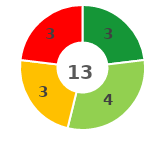
| Category | Series 0 |
|---|---|
| 0 | 3 |
| 1 | 4 |
| 2 | 3 |
| 3 | 3 |
| 4 | 0 |